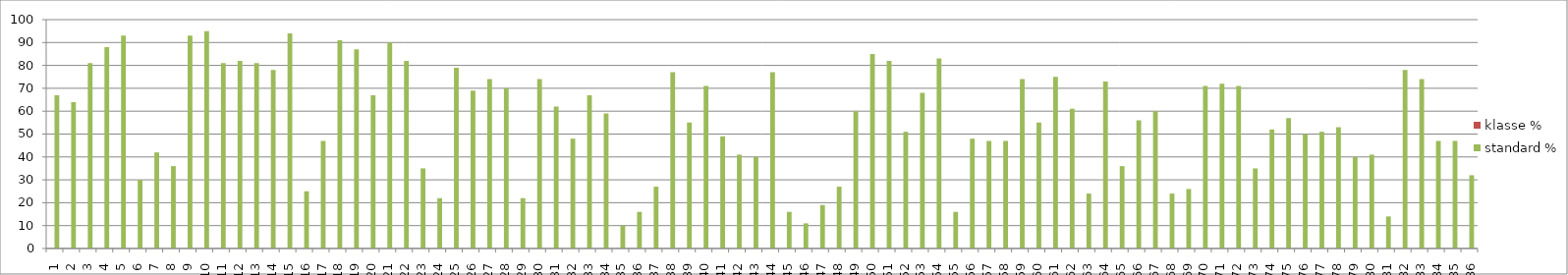
| Category | klasse % | standard % |
|---|---|---|
| 1.0 | 0 | 67 |
| 2.0 | 0 | 64 |
| 3.0 | 0 | 81 |
| 4.0 | 0 | 88 |
| 5.0 | 0 | 93 |
| 6.0 | 0 | 30 |
| 7.0 | 0 | 42 |
| 8.0 | 0 | 36 |
| 9.0 | 0 | 93 |
| 10.0 | 0 | 95 |
| 11.0 | 0 | 81 |
| 12.0 | 0 | 82 |
| 13.0 | 0 | 81 |
| 14.0 | 0 | 78 |
| 15.0 | 0 | 94 |
| 16.0 | 0 | 25 |
| 17.0 | 0 | 47 |
| 18.0 | 0 | 91 |
| 19.0 | 0 | 87 |
| 20.0 | 0 | 67 |
| 21.0 | 0 | 90 |
| 22.0 | 0 | 82 |
| 23.0 | 0 | 35 |
| 24.0 | 0 | 22 |
| 25.0 | 0 | 79 |
| 26.0 | 0 | 69 |
| 27.0 | 0 | 74 |
| 28.0 | 0 | 70 |
| 29.0 | 0 | 22 |
| 30.0 | 0 | 74 |
| 31.0 | 0 | 62 |
| 32.0 | 0 | 48 |
| 33.0 | 0 | 67 |
| 34.0 | 0 | 59 |
| 35.0 | 0 | 10 |
| 36.0 | 0 | 16 |
| 37.0 | 0 | 27 |
| 38.0 | 0 | 77 |
| 39.0 | 0 | 55 |
| 40.0 | 0 | 71 |
| 41.0 | 0 | 49 |
| 42.0 | 0 | 41 |
| 43.0 | 0 | 40 |
| 44.0 | 0 | 77 |
| 45.0 | 0 | 16 |
| 46.0 | 0 | 11 |
| 47.0 | 0 | 19 |
| 48.0 | 0 | 27 |
| 49.0 | 0 | 60 |
| 50.0 | 0 | 85 |
| 51.0 | 0 | 82 |
| 52.0 | 0 | 51 |
| 53.0 | 0 | 68 |
| 54.0 | 0 | 83 |
| 55.0 | 0 | 16 |
| 56.0 | 0 | 48 |
| 57.0 | 0 | 47 |
| 58.0 | 0 | 47 |
| 59.0 | 0 | 74 |
| 60.0 | 0 | 55 |
| 61.0 | 0 | 75 |
| 62.0 | 0 | 61 |
| 63.0 | 0 | 24 |
| 64.0 | 0 | 73 |
| 65.0 | 0 | 36 |
| 66.0 | 0 | 56 |
| 67.0 | 0 | 60 |
| 68.0 | 0 | 24 |
| 69.0 | 0 | 26 |
| 70.0 | 0 | 71 |
| 71.0 | 0 | 72 |
| 72.0 | 0 | 71 |
| 73.0 | 0 | 35 |
| 74.0 | 0 | 52 |
| 75.0 | 0 | 57 |
| 76.0 | 0 | 50 |
| 77.0 | 0 | 51 |
| 78.0 | 0 | 53 |
| 79.0 | 0 | 40 |
| 80.0 | 0 | 41 |
| 81.0 | 0 | 14 |
| 82.0 | 0 | 78 |
| 83.0 | 0 | 74 |
| 84.0 | 0 | 47 |
| 85.0 | 0 | 47 |
| 86.0 | 0 | 32 |